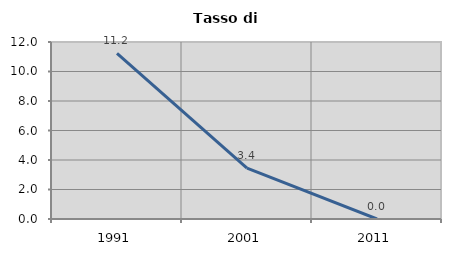
| Category | Tasso di disoccupazione   |
|---|---|
| 1991.0 | 11.236 |
| 2001.0 | 3.448 |
| 2011.0 | 0 |